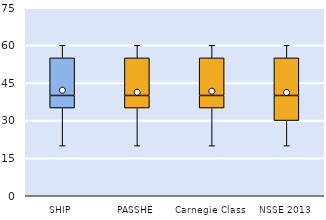
| Category | 25th | 50th | 75th |
|---|---|---|---|
| SHIP | 35 | 5 | 15 |
| PASSHE | 35 | 5 | 15 |
| Carnegie Class | 35 | 5 | 15 |
| NSSE 2013 | 30 | 10 | 15 |